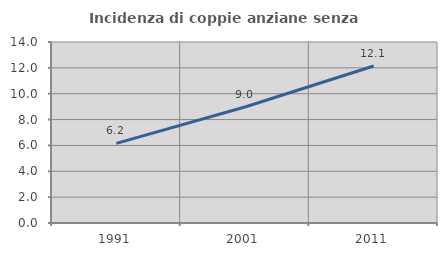
| Category | Incidenza di coppie anziane senza figli  |
|---|---|
| 1991.0 | 6.158 |
| 2001.0 | 8.974 |
| 2011.0 | 12.144 |